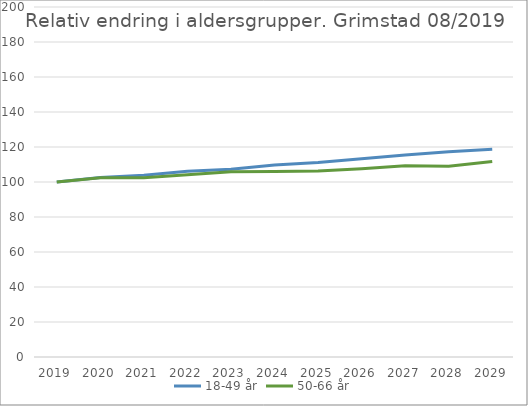
| Category | 18-49 år | 50-66 år |
|---|---|---|
| 2019 | 100 | 100 |
| 2020 | 102.638 | 102.485 |
| 2021 | 103.907 | 102.441 |
| 2022 | 106.198 | 104.086 |
| 2023 | 107.264 | 105.834 |
| 2024 | 109.657 | 105.955 |
| 2025 | 111.128 | 106.321 |
| 2026 | 113.248 | 107.606 |
| 2027 | 115.464 | 109.221 |
| 2028 | 117.238 | 109.009 |
| 2029 | 118.644 | 111.709 |